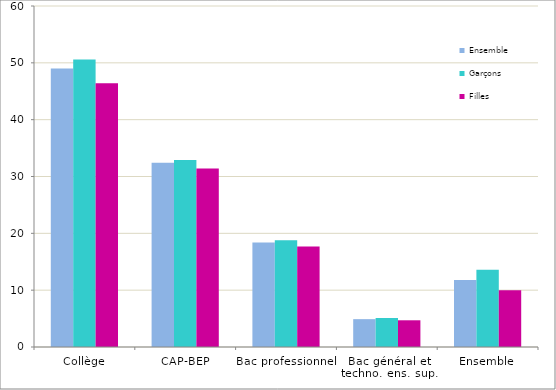
| Category | Ensemble | Garçons | Filles |
|---|---|---|---|
| Collège | 49 | 50.6 | 46.4 |
| CAP-BEP | 32.4 | 32.9 | 31.4 |
| Bac professionnel | 18.4 | 18.8 | 17.7 |
| Bac général et techno. ens. sup. | 4.9 | 5.1 | 4.7 |
| Ensemble | 11.8 | 13.6 | 10 |